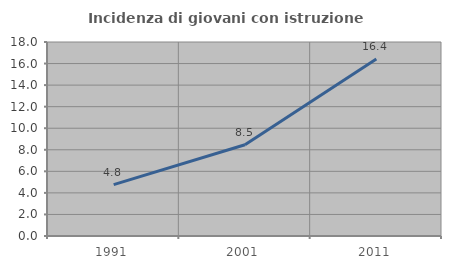
| Category | Incidenza di giovani con istruzione universitaria |
|---|---|
| 1991.0 | 4.762 |
| 2001.0 | 8.468 |
| 2011.0 | 16.418 |